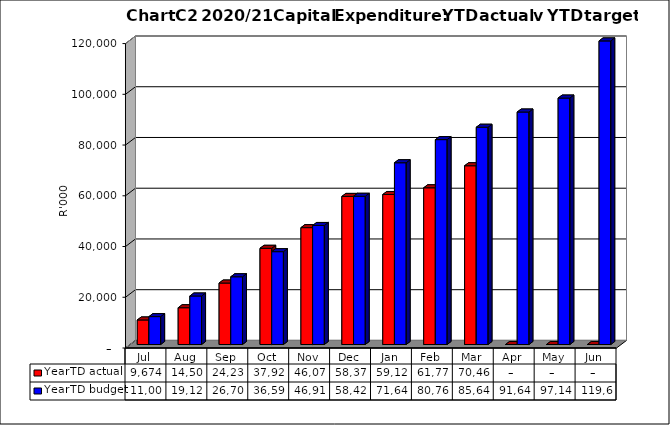
| Category | YearTD actual | YearTD budget |
|---|---|---|
| Jul | 9673670 | 11004000 |
| Aug | 14502563 | 19124000 |
| Sep | 24232126 | 26702000 |
| Oct | 37926605 | 36597000 |
| Nov | 46071132 | 46917000 |
| Dec | 58371063 | 58427000 |
| Jan | 59128639 | 71642000 |
| Feb | 61776639 | 80764000 |
| Mar | 70469422.07 | 85644000 |
| Apr | 0 | 91644000 |
| May | 0 | 97149000 |
| Jun | 0 | 119672000 |